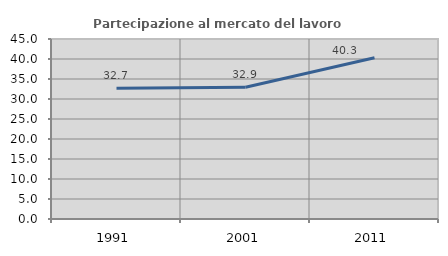
| Category | Partecipazione al mercato del lavoro  femminile |
|---|---|
| 1991.0 | 32.678 |
| 2001.0 | 32.935 |
| 2011.0 | 40.32 |